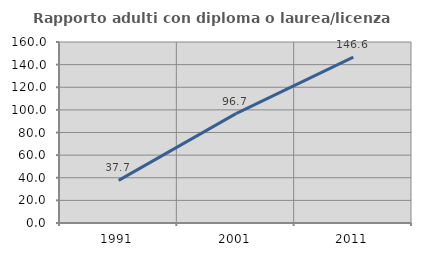
| Category | Rapporto adulti con diploma o laurea/licenza media  |
|---|---|
| 1991.0 | 37.705 |
| 2001.0 | 96.667 |
| 2011.0 | 146.552 |